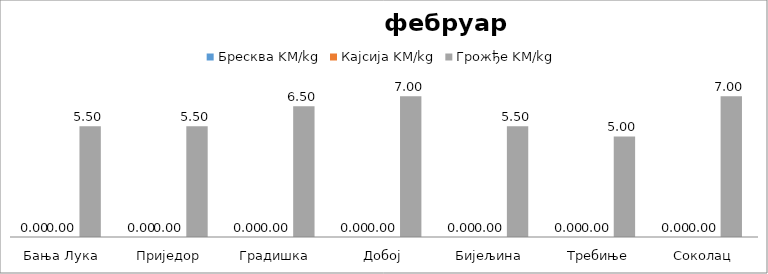
| Category | Бресква | Кајсија | Грожђе |
|---|---|---|---|
| Бања Лука | 0 | 0 | 5.5 |
| Приједор | 0 | 0 | 5.5 |
| Градишка | 0 | 0 | 6.5 |
| Добој | 0 | 0 | 7 |
| Бијељина | 0 | 0 | 5.5 |
|  Требиње | 0 | 0 | 5 |
| Соколац | 0 | 0 | 7 |